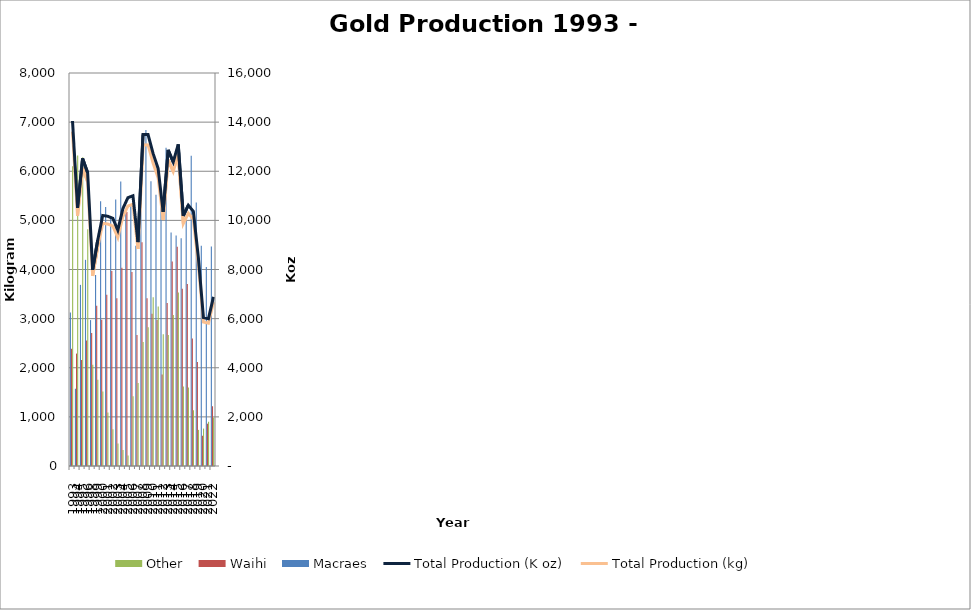
| Category | Macraes | Waihi | Other |
|---|---|---|---|
| 1993.0 | 3125.46 | 2386.18 | 6102.36 |
| 1994.0 | 1571.47 | 2288.52 | 6320.13 |
| 1995.0 | 3686.99 | 2158.6 | 6286.41 |
| 1996.0 | 4196.77 | 2555.8 | 4818.77 |
| 1998.0 | 2970 | 2708 | 2060.7 |
| 1999.0 | 3886 | 3261 | 1756.1 |
| 2000.0 | 5387 | 2978 | 1515.31 |
| 2001.0 | 5274 | 3488 | 1088.67 |
| 2002.0 | 5051 | 3972 | 748.13 |
| 2003.0 | 5426 | 3417 | 458.46 |
| 2004.0 | 5791.4 | 4035 | 324.215 |
| 2005.0 | 5198.624 | 5172.356 | 212.241 |
| 2006.0 | 5287.379 | 3950.359 | 1420.162 |
| 2007.0 | 4481.172 | 2664.479 | 1687.507 |
| 2008.0 | 5995.24 | 4555.104 | 2524.255 |
| 2009.0 | 6837.92 | 3412.394 | 2823.12 |
| 2010.0 | 5795.22 | 3098.13 | 3435.58 |
| 2011.0 | 5519.16 | 2971.875 | 3246.66 |
| 2012.0 | 5473.62 | 1864.456 | 2683.02 |
| 2013.0 | 6480.84 | 3317.84 | 2668.932 |
| 2014.0 | 4752.53 | 4164.05 | 3072.836 |
| 2015.0 | 4692.803 | 4465.001 | 3529.48 |
| 2016.0 | 4637.1 | 3608.88 | 1619.79 |
| 2017.0 | 4984.802 | 3703.929 | 1598.81 |
| 2018.0 | 6313.66 | 2596.89 | 1134.91 |
| 2019.0 | 5364.573 | 2117.59 | 735.15 |
| 2020.0 | 4482.789 | 615.04 | 762.12 |
| 2021.0 | 4053.25 | 861.007 | 900.33 |
| 2022.0 | 4468.7 | 1216.43 | 988.4 |